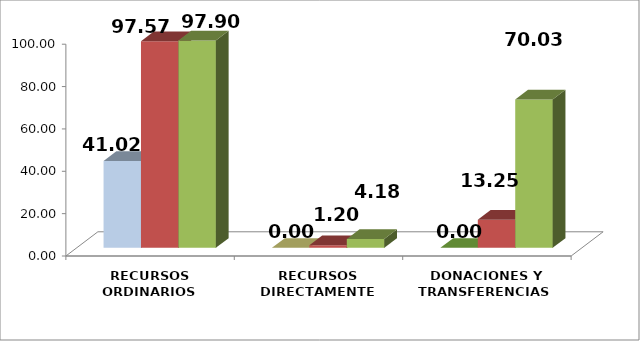
| Category | 1er Trimestre | 2do Trimestre | 3er Trimestre |
|---|---|---|---|
| RECURSOS ORDINARIOS | 41.016 | 97.57 | 97.904 |
| RECURSOS DIRECTAMENTE RECAUDADOS  | 0 | 1.197 | 4.176 |
| DONACIONES Y TRANSFERENCIAS  | 0 | 13.25 | 70.032 |